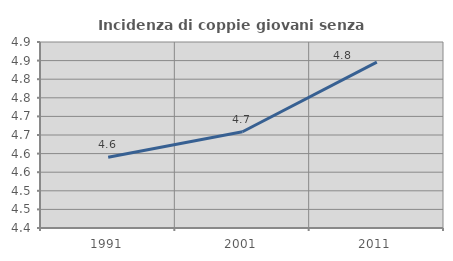
| Category | Incidenza di coppie giovani senza figli |
|---|---|
| 1991.0 | 4.59 |
| 2001.0 | 4.659 |
| 2011.0 | 4.846 |